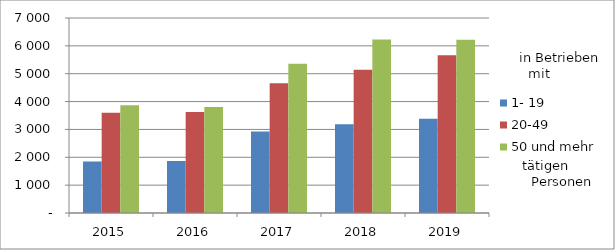
| Category | 1- 19 | 20-49 | 50 und mehr |
|---|---|---|---|
| 2015.0 | 1848 | 3603 | 3869 |
| 2016.0 | 1863 | 3623 | 3801 |
| 2017.0 | 2930 | 4661 | 5360 |
| 2018.0 | 3184 | 5139 | 6227 |
| 2019.0 | 3387 | 5663 | 6215 |